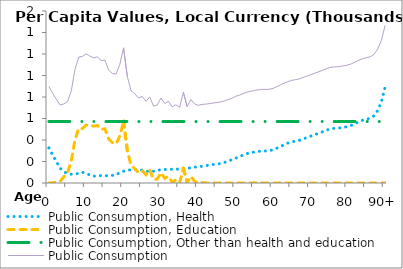
| Category | Public Consumption, Health | Public Consumption, Education | Public Consumption, Other than health and education | Public Consumption |
|---|---|---|---|---|
| 0 | 326.771 | 0 | 571.883 | 898.655 |
|  | 260.133 | 2.152 | 571.883 | 834.169 |
| 2 | 200.45 | 6.611 | 571.883 | 778.945 |
| 3 | 138.189 | 15.562 | 571.883 | 725.635 |
| 4 | 105.639 | 57.939 | 571.883 | 735.461 |
| 5 | 87.557 | 97.819 | 571.883 | 757.26 |
| 6 | 81.91 | 203.356 | 571.883 | 857.15 |
| 7 | 83.429 | 403.116 | 571.883 | 1058.429 |
| 8 | 90.201 | 509.614 | 571.883 | 1171.7 |
| 9 | 99.107 | 506.586 | 571.883 | 1177.577 |
| 10 | 90.861 | 539.106 | 571.883 | 1201.851 |
| 11 | 72.533 | 535.388 | 571.883 | 1179.805 |
| 12 | 63.577 | 528.841 | 571.883 | 1164.302 |
| 13 | 66.558 | 534.799 | 571.883 | 1173.241 |
| 14 | 68.829 | 498.797 | 571.883 | 1139.51 |
| 15 | 67.85 | 503.946 | 571.883 | 1143.68 |
| 16 | 67.335 | 411.075 | 571.883 | 1050.294 |
| 17 | 71.136 | 375.938 | 571.883 | 1018.959 |
| 18 | 76.992 | 364.817 | 571.883 | 1013.693 |
| 19 | 95.173 | 437.792 | 571.883 | 1104.849 |
| 20 | 109.585 | 575.775 | 571.883 | 1257.245 |
| 21 | 118.436 | 299.664 | 571.883 | 989.985 |
| 22 | 123.668 | 163.576 | 571.883 | 859.128 |
| 23 | 125.186 | 132.816 | 571.883 | 829.886 |
| 24 | 122.707 | 96.485 | 571.883 | 791.076 |
| 25 | 119.461 | 114.422 | 571.883 | 805.768 |
| 26 | 110.525 | 77.42 | 571.883 | 759.828 |
| 27 | 105.346 | 123.636 | 571.883 | 800.865 |
| 28 | 110.222 | 33.491 | 571.883 | 715.597 |
| 29 | 117.898 | 34.989 | 571.883 | 724.771 |
| 30 | 122.45 | 95.406 | 571.883 | 789.741 |
| 31 | 125.161 | 42.806 | 571.883 | 739.851 |
| 32 | 126.845 | 60.748 | 571.883 | 759.477 |
| 33 | 127.813 | 9.056 | 571.883 | 708.753 |
| 34 | 127.737 | 28.261 | 571.883 | 727.882 |
| 35 | 130.981 | 0.731 | 571.883 | 703.595 |
| 36 | 134.041 | 137.513 | 571.883 | 843.438 |
| 37 | 135.422 | 4.242 | 571.883 | 711.547 |
| 38 | 142.395 | 61.302 | 571.883 | 775.581 |
| 39 | 147.836 | 16.477 | 571.883 | 736.197 |
| 40 | 150.302 | 0 | 571.883 | 722.186 |
| 41 | 155.512 | 4.089 | 571.883 | 731.485 |
| 42 | 161.835 | 0 | 571.883 | 733.719 |
| 43 | 166.944 | 0 | 571.883 | 738.828 |
| 44 | 172.242 | 0 | 571.883 | 744.126 |
| 45 | 176.963 | 0 | 571.883 | 748.847 |
| 46 | 181.09 | 1.752 | 571.883 | 754.726 |
| 47 | 191.093 | 0.669 | 571.883 | 763.646 |
| 48 | 204.48 | 0 | 571.883 | 776.364 |
| 49 | 216.029 | 0 | 571.883 | 787.913 |
| 50 | 230.619 | 4.276 | 571.883 | 806.779 |
| 51 | 245.515 | 0 | 571.883 | 817.398 |
| 52 | 259.864 | 0 | 571.883 | 831.748 |
| 53 | 273.279 | 0 | 571.883 | 845.163 |
| 54 | 281.254 | 0 | 571.883 | 853.138 |
| 55 | 287.91 | 1.675 | 571.883 | 861.468 |
| 56 | 293.536 | 0 | 571.883 | 865.42 |
| 57 | 297.444 | 1.467 | 571.883 | 870.795 |
| 58 | 297.966 | 0 | 571.883 | 869.85 |
| 59 | 300.331 | 0 | 571.883 | 872.215 |
| 60 | 308.209 | 0 | 571.883 | 880.093 |
| 61 | 323.827 | 0 | 571.883 | 895.711 |
| 62 | 338.489 | 1.98 | 571.883 | 912.353 |
| 63 | 357.164 | 0 | 571.883 | 929.048 |
| 64 | 371.649 | 0 | 571.883 | 943.533 |
| 65 | 383.05 | 0 | 571.883 | 954.934 |
| 66 | 389.644 | 0 | 571.883 | 961.528 |
| 67 | 396.037 | 0 | 571.883 | 967.921 |
| 68 | 409.586 | 0 | 571.883 | 981.47 |
| 69 | 421.654 | 0 | 571.883 | 993.538 |
| 70 | 434.866 | 0 | 571.883 | 1006.75 |
| 71 | 447.18 | 0 | 571.883 | 1019.064 |
| 72 | 460.372 | 0 | 571.883 | 1032.256 |
| 73 | 473.322 | 0 | 571.883 | 1045.206 |
| 74 | 487.287 | 0 | 571.883 | 1059.171 |
| 75 | 499.781 | 0 | 571.883 | 1071.665 |
| 76 | 507.413 | 0 | 571.883 | 1079.297 |
| 77 | 509.826 | 0 | 571.883 | 1081.71 |
| 78 | 512.723 | 0 | 571.883 | 1084.607 |
| 79 | 518.235 | 0 | 571.883 | 1090.119 |
| 80 | 526.158 | 0 | 571.883 | 1098.042 |
| 81 | 537.283 | 0 | 571.883 | 1109.167 |
| 82 | 553.624 | 0 | 571.883 | 1125.508 |
| 83 | 570.665 | 0 | 571.883 | 1142.55 |
| 84 | 584.395 | 0 | 571.883 | 1156.279 |
| 85 | 593.8 | 0 | 571.883 | 1165.684 |
| 86 | 602.092 | 0 | 571.883 | 1173.976 |
| 87 | 624.698 | 0 | 571.883 | 1196.582 |
| 88 | 673.285 | 0 | 571.883 | 1245.169 |
| 89 | 755.036 | 0 | 571.883 | 1326.921 |
| 90+ | 894.408 | 0 | 571.883 | 1466.292 |